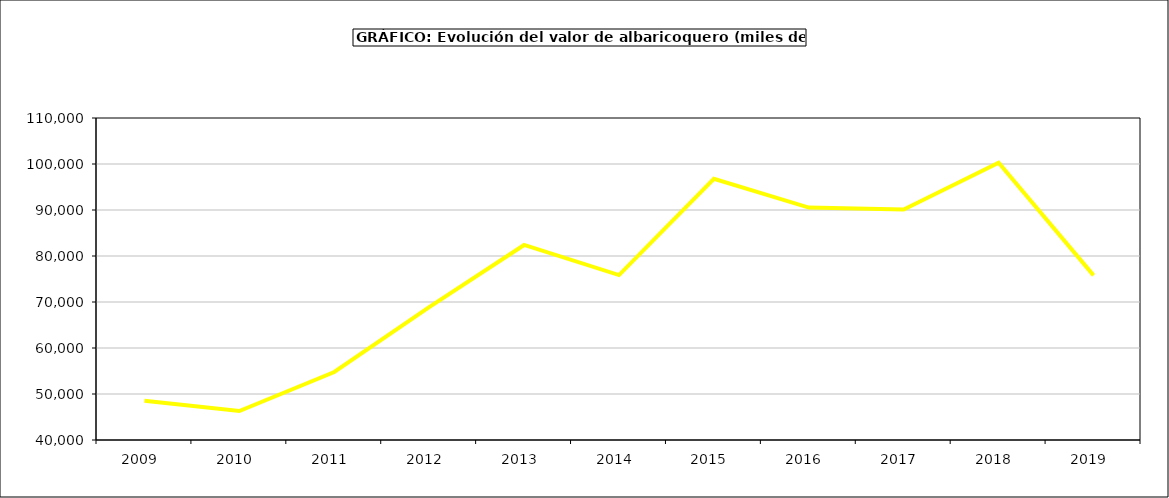
| Category | valor albaricoquero |
|---|---|
| 2009.0 | 48553.188 |
| 2010.0 | 46289.905 |
| 2011.0 | 54777.84 |
| 2012.0 | 68866.776 |
| 2013.0 | 82399.533 |
| 2014.0 | 75850.331 |
| 2015.0 | 96779 |
| 2016.0 | 90534 |
| 2017.0 | 90084.503 |
| 2018.0 | 100255.554 |
| 2019.0 | 75785.772 |